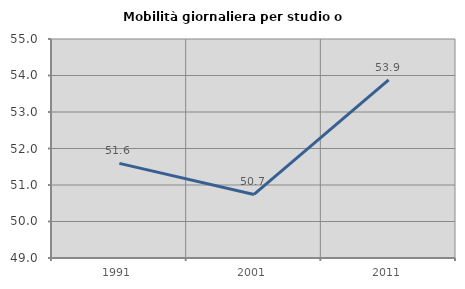
| Category | Mobilità giornaliera per studio o lavoro |
|---|---|
| 1991.0 | 51.591 |
| 2001.0 | 50.742 |
| 2011.0 | 53.878 |